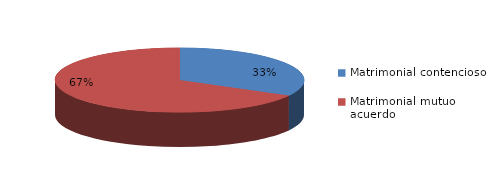
| Category | Series 0 |
|---|---|
| 0 | 1155 |
| 1 | 2345 |